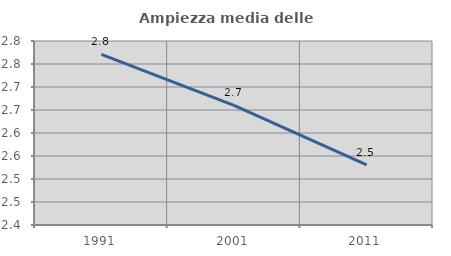
| Category | Ampiezza media delle famiglie |
|---|---|
| 1991.0 | 2.771 |
| 2001.0 | 2.66 |
| 2011.0 | 2.531 |